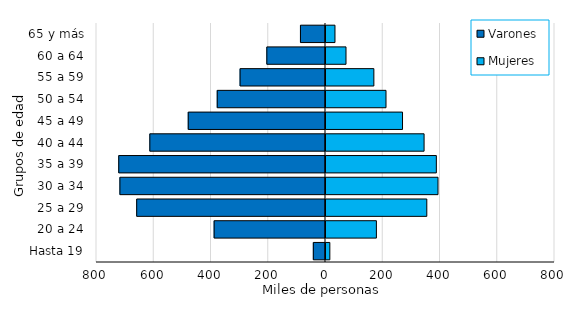
| Category | Varones | Mujeres |
|---|---|---|
| Hasta 19 | -42518 | 16892 |
| 20 a 24 | -389029 | 179546 |
| 25 a 29 | -659589 | 355659 |
| 30 a 34 | -718219 | 394760 |
| 35 a 39 | -722294 | 388990 |
| 40 a 44 | -613665 | 346152 |
| 45 a 49 | -479477 | 270797 |
| 50 a 54 | -378212 | 213140 |
| 55 a 59 | -298406 | 170732 |
| 60 a 64 | -204957 | 73380 |
| 65 y más | -87475 | 34875 |